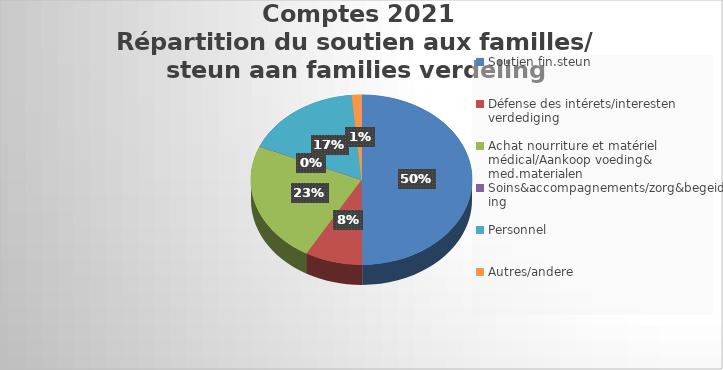
| Category | Series 0 |
|---|---|
| Soutien fin.steun | 694704.78 |
| Défense des intérets/interesten verdediging | 116594.28 |
| Achat nourriture et matériel médical/Aankoop voeding& med.materialen | 322087.88 |
| Soins&accompagnements/zorg&begeiding | 335.18 |
| Personnel | 238720.81 |
| Autres/andere | 19914.88 |